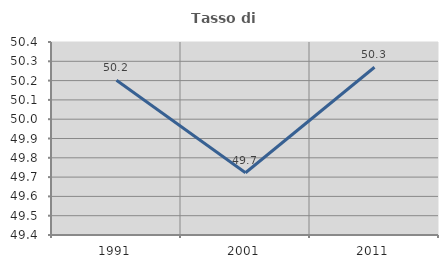
| Category | Tasso di occupazione   |
|---|---|
| 1991.0 | 50.201 |
| 2001.0 | 49.722 |
| 2011.0 | 50.269 |